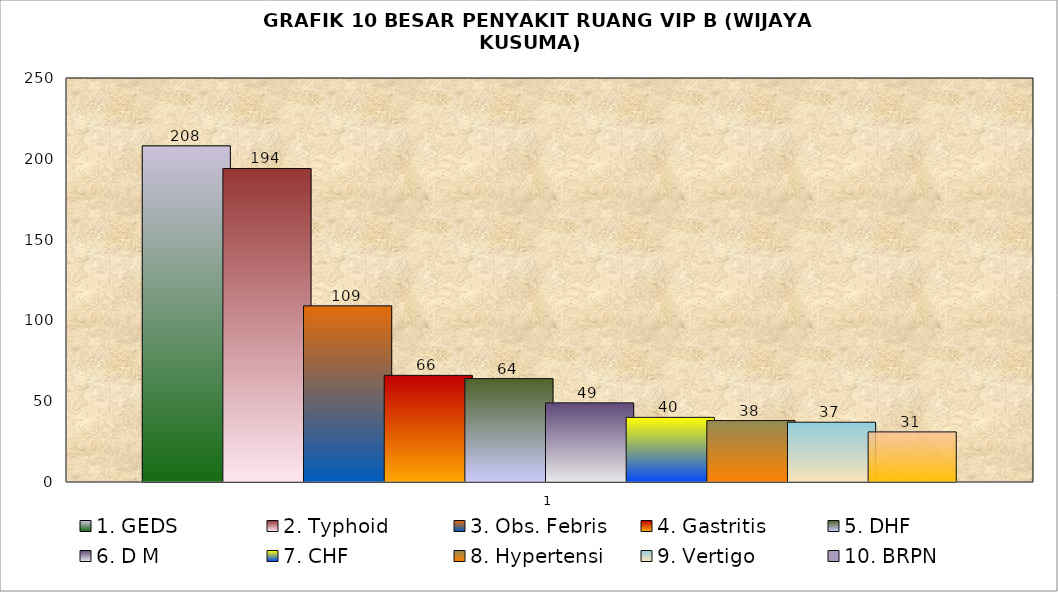
| Category | 1. GEDS | 2. Typhoid | 3. Obs. Febris | 4. Gastritis | 5. DHF | 6. D M | 7. CHF | 8. Hypertensi | 9. Vertigo | 10. BRPN |
|---|---|---|---|---|---|---|---|---|---|---|
| 0 | 208 | 194 | 109 | 66 | 64 | 49 | 40 | 38 | 37 | 31 |